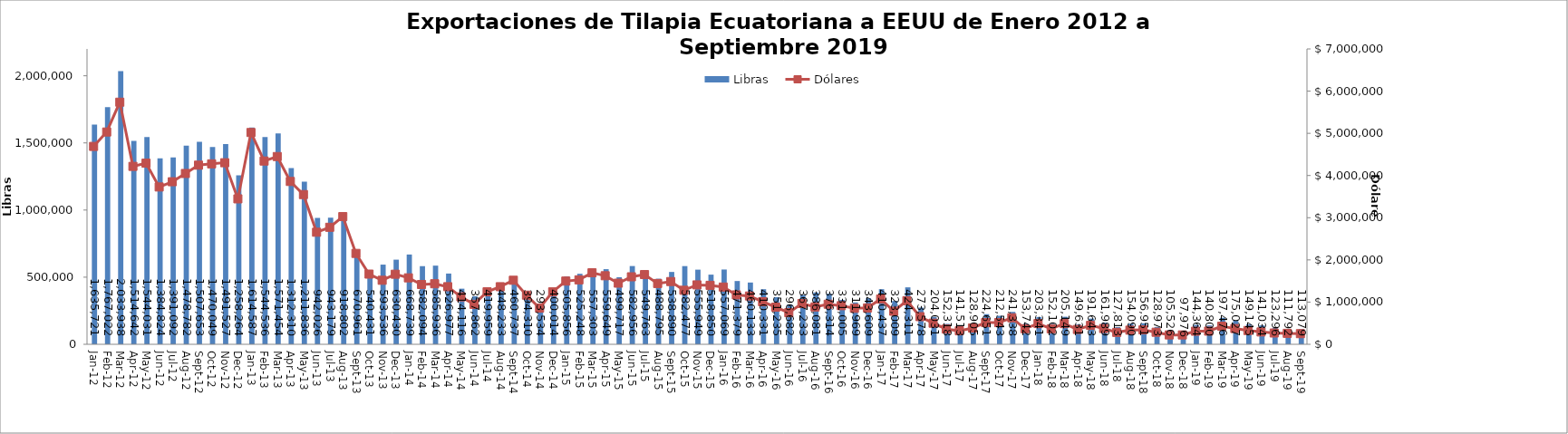
| Category | Libras  |
|---|---|
| 2012-01-01 | 1635720.607 |
| 2012-02-01 | 1767022.174 |
| 2012-03-01 | 2033937.505 |
| 2012-04-01 | 1514641.77 |
| 2012-05-01 | 1544031.293 |
| 2012-06-01 | 1384823.899 |
| 2012-07-01 | 1391091.577 |
| 2012-08-01 | 1478781.747 |
| 2012-09-01 | 1507653.188 |
| 2012-10-01 | 1470049.326 |
| 2012-11-01 | 1491526.539 |
| 2012-12-01 | 1258264 |
| 2013-01-01 | 1614587 |
| 2013-02-01 | 1544536.146 |
| 2013-03-01 | 1571454.312 |
| 2013-04-01 | 1312310.196 |
| 2013-05-01 | 1211835.551 |
| 2013-06-01 | 942025.58 |
| 2013-07-01 | 943178.586 |
| 2013-08-01 | 918802.324 |
| 2013-09-01 | 670961.192 |
| 2013-10-01 | 540431.235 |
| 2013-11-01 | 593535.64 |
| 2013-12-01 | 630429.621 |
| 2014-01-01 | 668739 |
| 2014-02-01 | 582093.766 |
| 2014-03-01 | 585936.383 |
| 2014-04-01 | 526976.561 |
| 2014-05-01 | 414116.473 |
| 2014-06-01 | 357861.695 |
| 2014-07-01 | 419958.663 |
| 2014-08-01 | 448233 |
| 2014-09-01 | 460737.149 |
| 2014-10-01 | 394310.347 |
| 2014-11-01 | 293533.672 |
| 2014-12-01 | 400013.647 |
| 2015-01-01 | 505856.493 |
| 2015-02-01 | 525248 |
| 2015-03-01 | 557303.039 |
| 2015-04-01 | 559648.733 |
| 2015-05-01 | 499716.682 |
| 2015-06-01 | 582955.764 |
| 2015-07-01 | 549763.307 |
| 2015-08-01 | 488795.094 |
| 2015-09-01 | 538890.219 |
| 2015-10-01 | 582477.366 |
| 2015-11-01 | 555949.414 |
| 2015-12-01 | 518850.405 |
| 2016-01-01 | 557069.351 |
| 2016-02-01 | 471378.754 |
| 2016-03-01 | 460133.089 |
| 2016-04-01 | 410331.175 |
| 2016-05-01 | 351235 |
| 2016-06-01 | 296682 |
| 2016-07-01 | 367233.45 |
| 2016-08-01 | 386080.575 |
| 2016-09-01 | 376314.197 |
| 2016-10-01 | 331005.258 |
| 2016-11-01 | 311968.537 |
| 2016-12-01 | 343608.956 |
| 2017-01-01 | 410436.996 |
| 2017-02-01 | 323009.174 |
| 2017-03-01 | 424310.544 |
| 2017-04-01 | 273577.632 |
| 2017-05-01 | 204031.321 |
| 2017-06-01 | 152318.019 |
| 2017-07-01 | 141513.274 |
| 2017-08-01 | 128905.167 |
| 2017-09-01 | 224650.945 |
| 2017-10-01 | 212543.281 |
| 2017-11-01 | 241337.562 |
| 2017-12-01 | 153742.19 |
| 2018-01-01 | 203341.281 |
| 2018-02-01 | 152101.968 |
| 2018-03-01 | 205149.053 |
| 2018-04-01 | 149630.611 |
| 2018-05-01 | 191643 |
| 2018-06-01 | 161989 |
| 2018-07-01 | 127813 |
| 2018-08-01 | 154089.894 |
| 2018-09-01 | 156951.494 |
| 2018-10-01 | 128972.628 |
| 2018-11-01 | 105526.466 |
| 2018-12-01 | 97975.634 |
| 2019-01-01 | 144364.157 |
| 2019-02-01 | 140800 |
| 2019-03-01 | 197476 |
| 2019-04-01 | 175027.19 |
| 2019-05-01 | 149144.92 |
| 2019-06-01 | 141034.12 |
| 2019-07-01 | 123295.72 |
| 2019-08-01 | 111792 |
| 2019-09-01 | 113079.347 |